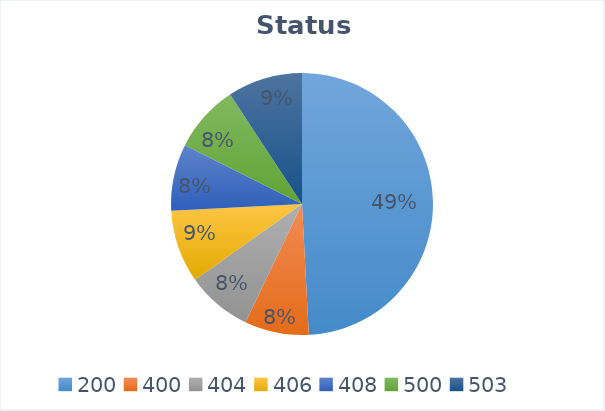
| Category | Code Count |
|---|---|
| 200.0 | 0.492 |
| 400.0 | 0.079 |
| 404.0 | 0.081 |
| 406.0 | 0.09 |
| 408.0 | 0.082 |
| 500.0 | 0.083 |
| 503.0 | 0.093 |